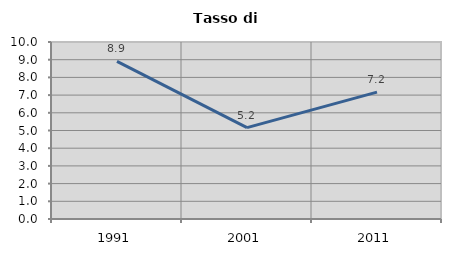
| Category | Tasso di disoccupazione   |
|---|---|
| 1991.0 | 8.907 |
| 2001.0 | 5.16 |
| 2011.0 | 7.169 |